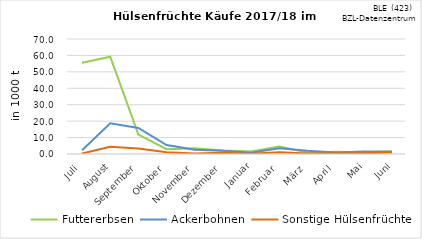
| Category | Futtererbsen | Ackerbohnen | Sonstige Hülsenfrüchte |
|---|---|---|---|
| Juli | 55.536 | 2.25 | 0.317 |
| August | 59.217 | 18.658 | 4.372 |
| September | 11.849 | 15.849 | 3.414 |
| Oktober | 2.959 | 5.425 | 1.014 |
| November | 3.465 | 2.593 | 0.344 |
| Dezember | 2.136 | 2.031 | 0.773 |
| Januar | 1.519 | 0.836 | 0.203 |
| Februar | 4.524 | 3.534 | 1.094 |
| März | 0.873 | 1.954 | 0.342 |
| April | 1.301 | 0.955 | 0.405 |
| Mai | 0.995 | 1.591 | 0.483 |
| Juni | 1.721 | 1.405 | 0.878 |